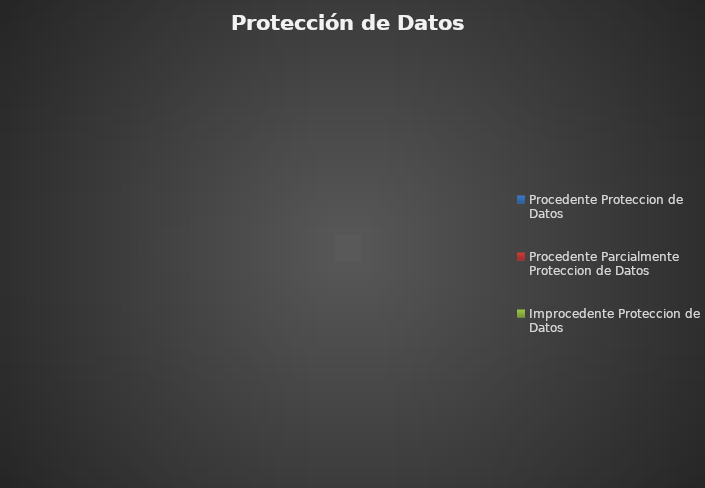
| Category | Series 0 |
|---|---|
| Procedente Proteccion de Datos | 0 |
| Procedente Parcialmente Proteccion de Datos | 0 |
| Improcedente Proteccion de Datos | 0 |